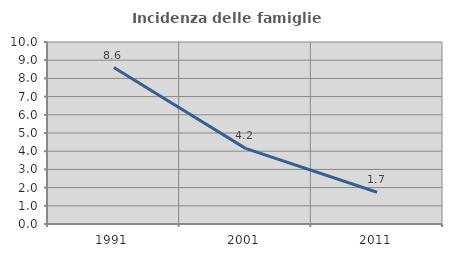
| Category | Incidenza delle famiglie numerose |
|---|---|
| 1991.0 | 8.596 |
| 2001.0 | 4.154 |
| 2011.0 | 1.746 |